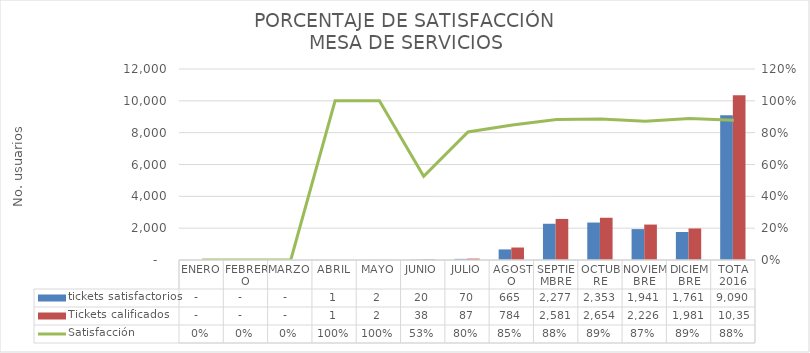
| Category | tickets satisfactorios | Tickets calificados |
|---|---|---|
| ENERO | 0 | 0 |
| FEBRERO | 0 | 0 |
| MARZO | 0 | 0 |
| ABRIL | 1 | 1 |
| MAYO | 2 | 2 |
| JUNIO | 20 | 38 |
| JULIO | 70 | 87 |
| AGOSTO | 665 | 784 |
| SEPTIEMBRE | 2277 | 2581 |
| OCTUBRE | 2353 | 2654 |
| NOVIEMBRE | 1941 | 2226 |
| DICIEMBRE | 1761 | 1981 |
| TOTA 2016 | 9090 | 10354 |